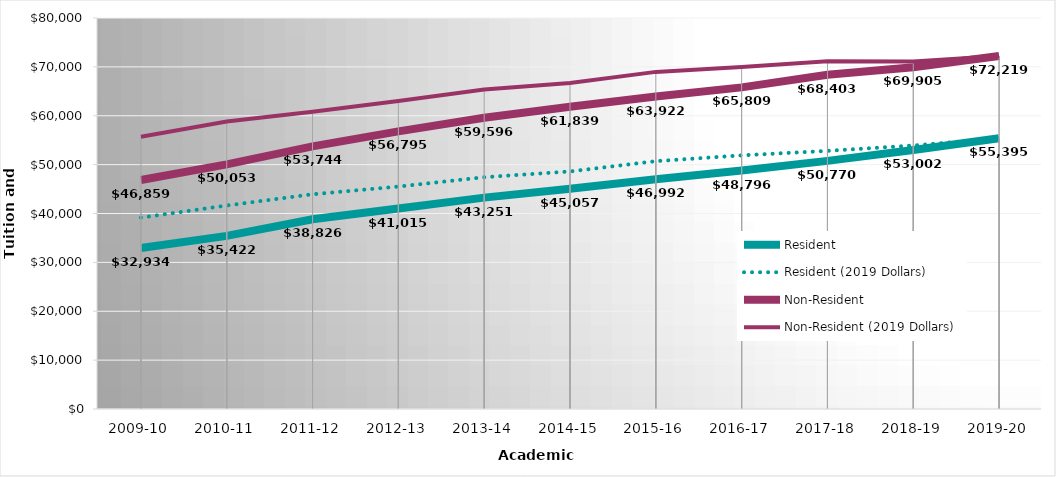
| Category | Resident | Resident (2019 Dollars) | Non-Resident | Non-Resident (2019 Dollars) |
|---|---|---|---|---|
| 2009-10 | 32934 | 39154 | 46859 | 55709 |
| 2010-11 | 35422 | 41636 | 50053 | 58834 |
| 2011-12 | 38826 | 43937 | 53744 | 60819 |
| 2012-13 | 41015 | 45508 | 56795 | 63017 |
| 2013-14 | 43251 | 47427 | 59596 | 65351 |
| 2014-15 | 45057 | 48602 | 61839 | 66704 |
| 2015-16 | 46992 | 50708 | 63922 | 68976 |
| 2016-17 | 48796 | 51895 | 65809 | 69988 |
| 2017-18 | 50770 | 52815 | 68403 | 71158 |
| 2018-19 | 53002 | 53909 | 69905 | 71101 |
| 2019-20 | 55395 | 55395 | 72219 | 72219 |